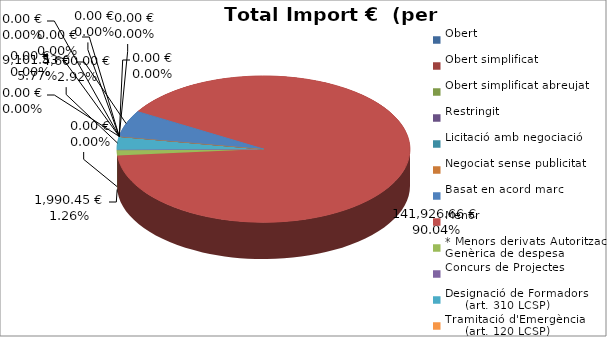
| Category | Total preu
(amb IVA) |
|---|---|
| Obert | 0 |
| Obert simplificat | 0 |
| Obert simplificat abreujat | 0 |
| Restringit | 0 |
| Licitació amb negociació | 0 |
| Negociat sense publicitat | 0 |
| Basat en acord marc | 9101.53 |
| Menor | 141926.66 |
| * Menors derivats Autorització Genèrica de despesa | 1990.45 |
| Concurs de Projectes | 0 |
| Designació de Formadors
     (art. 310 LCSP) | 4600 |
| Tramitació d'Emergència
     (art. 120 LCSP) | 0 |